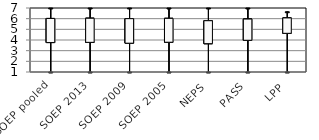
| Category | Series 0 | Series 1 | Series 2 | Series 3 |
|---|---|---|---|---|
| SOEP pooled | 3.76 | 7 | 1 | 6.02 |
| SOEP 2013 | 3.78 | 7 | 1 | 6.04 |
| SOEP 2009 | 3.7 | 7 | 1 | 6 |
| SOEP 2005 | 3.79 | 7 | 1 | 6.03 |
| NEPS | 3.655 | 7 | 1 | 5.809 |
| PASS | 3.976 | 7 | 1 | 5.964 |
| LPP | 4.626 | 6.65 | 1 | 6.07 |